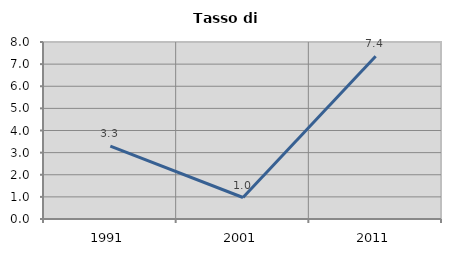
| Category | Tasso di disoccupazione   |
|---|---|
| 1991.0 | 3.297 |
| 2001.0 | 0.971 |
| 2011.0 | 7.353 |